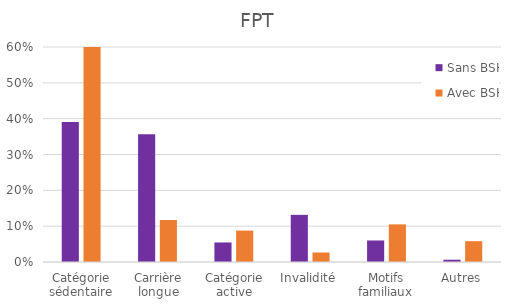
| Category | Sans BSHE | Avec BSHE |
|---|---|---|
| Catégorie sédentaire | 0.391 | 0.606 |
| Carrière longue | 0.357 | 0.117 |
| Catégorie active | 0.055 | 0.088 |
| Invalidité | 0.132 | 0.027 |
| Motifs familiaux | 0.06 | 0.105 |
| Autres | 0.006 | 0.058 |